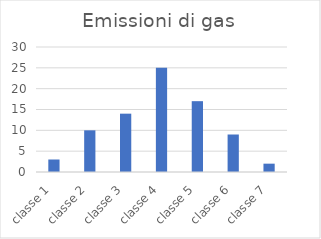
| Category | Series 0 |
|---|---|
| classe 1 | 3 |
| classe 2 | 10 |
| classe 3 | 14 |
| classe 4 | 25 |
| classe 5 | 17 |
| classe 6 | 9 |
| classe 7 | 2 |